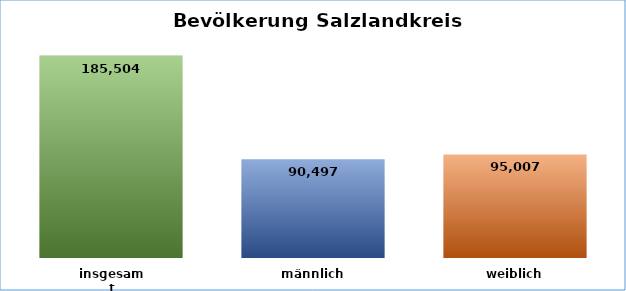
| Category | SLK |
|---|---|
| insgesamt | 185504 |
| männlich | 90497 |
| weiblich | 95007 |